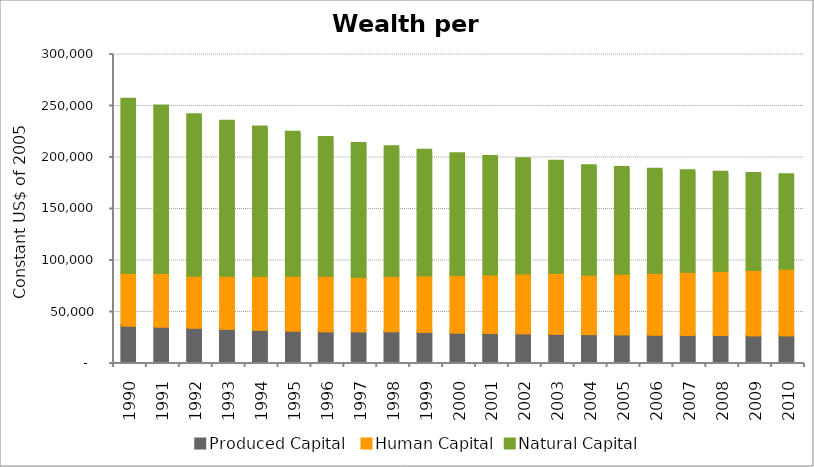
| Category | Produced Capital  | Human Capital | Natural Capital |
|---|---|---|---|
| 1990.0 | 35413.421 | 51284.441 | 168432.848 |
| 1991.0 | 34486.139 | 52064.366 | 162038.179 |
| 1992.0 | 33377.742 | 50704.739 | 155857.682 |
| 1993.0 | 32383.728 | 51513.045 | 149925.625 |
| 1994.0 | 31394.61 | 52415.52 | 144314.108 |
| 1995.0 | 30551.697 | 53424.085 | 138993.592 |
| 1996.0 | 29909.885 | 54114.961 | 134051.435 |
| 1997.0 | 29821.287 | 52899.87 | 129446.396 |
| 1998.0 | 29959.449 | 53841.22 | 125201.902 |
| 1999.0 | 29354.37 | 54839.095 | 121282.733 |
| 2000.0 | 28756.995 | 55873.971 | 117639.58 |
| 2001.0 | 28254.676 | 56973.713 | 114326.388 |
| 2002.0 | 28005.115 | 58048.333 | 111249.998 |
| 2003.0 | 27501.014 | 59131.419 | 108360.305 |
| 2004.0 | 27069.264 | 57885.291 | 105613.007 |
| 2005.0 | 26848.118 | 59016.424 | 102915.893 |
| 2006.0 | 26594.786 | 60143.449 | 100397.723 |
| 2007.0 | 26349.798 | 61328.565 | 97958.275 |
| 2008.0 | 26147.092 | 62538.767 | 95583.749 |
| 2009.0 | 25926.702 | 63719.571 | 93275.046 |
| 2010.0 | 26026.991 | 64843.775 | 90996.445 |